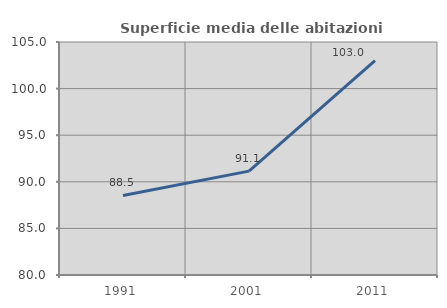
| Category | Superficie media delle abitazioni occupate |
|---|---|
| 1991.0 | 88.532 |
| 2001.0 | 91.145 |
| 2011.0 | 103.011 |